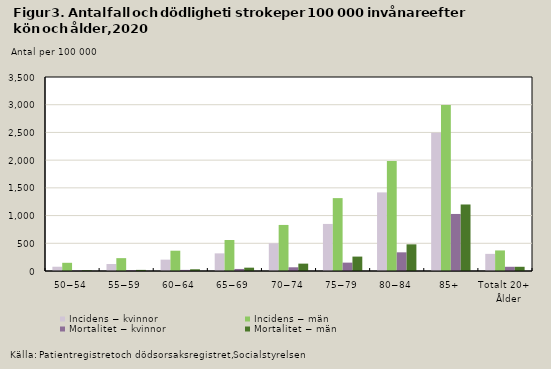
| Category | Incidens − kvinnor | Incidens − män | Mortalitet − kvinnor | Mortalitet − män |
|---|---|---|---|---|
| 50−54 | 77 | 148 | 6 | 12 |
| 55−59 | 126 | 232 | 12 | 20 |
| 60−64 | 205 | 366 | 20 | 31 |
| 65−69 | 318 | 559 | 37 | 60 |
| 70−74 | 500 | 831 | 67 | 133 |
| 75−79 | 849 | 1315 | 151 | 260 |
| 80−84 | 1418 | 1985 | 337 | 481 |
| 85+ | 2493 | 2994 | 1029 | 1200 |
| Totalt 20+ | 309 | 371 | 76 | 76 |